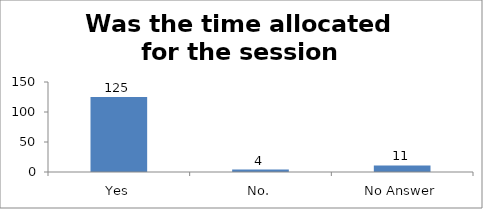
| Category | Was the time allocated for the session sufficient? |
|---|---|
| Yes | 125 |
| No. | 4 |
| No Answer | 11 |